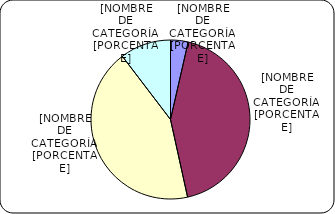
| Category | Series 0 |
|---|---|
| Menores de 3% | 442.6 |
| Entre 3% y 6% | 5325.7 |
| Entre 6% y 8% | 5339.7 |
| Entre 8% y 9% | 1284 |